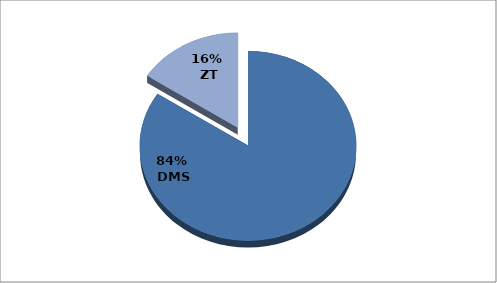
| Category | Series 0 |
|---|---|
| 0 | 688 |
| 1 | 129 |